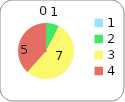
| Category | Series 0 |
|---|---|
| 0 | 0 |
| 1 | 1 |
| 2 | 7 |
| 3 | 5 |